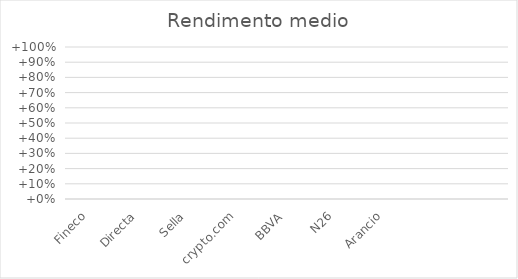
| Category | Rendimento medio |
|---|---|
| Fineco | 0 |
| Directa | 0 |
| Sella | 0 |
| crypto.com | 0 |
| BBVA | 0 |
| N26 | 0 |
| Arancio | 0 |